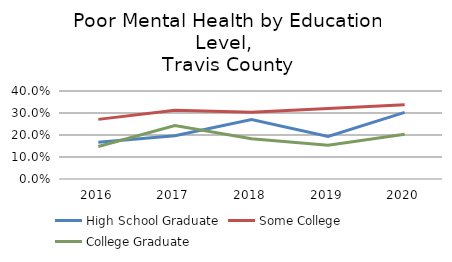
| Category | High School Graduate | Some College | College Graduate |
|---|---|---|---|
| 2016.0 | 0.167 | 0.271 | 0.148 |
| 2017.0 | 0.197 | 0.313 | 0.243 |
| 2018.0 | 0.27 | 0.303 | 0.183 |
| 2019.0 | 0.193 | 0.321 | 0.154 |
| 2020.0 | 0.303 | 0.337 | 0.203 |